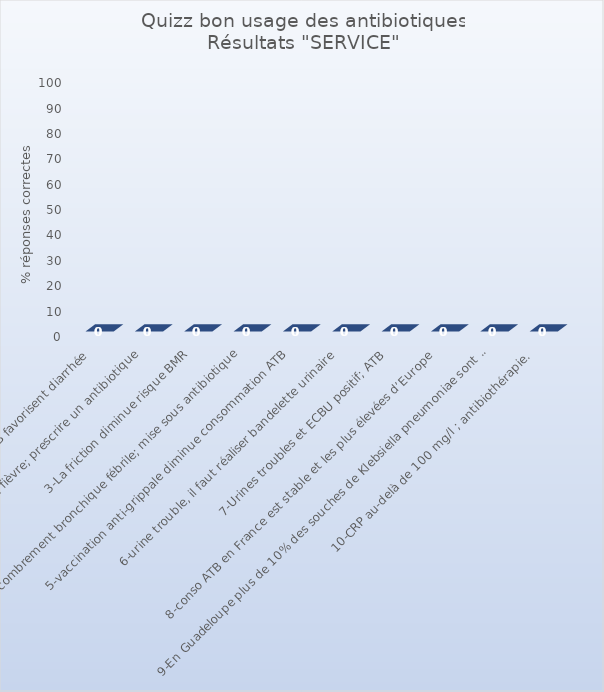
| Category | Series 0 |
|---|---|
| 1-ATB favorisent diarrhée | 0 |
| 2-escarre purulent et fièvre; prescrire un antibiotique | 0 |
| 3-La friction diminue risque BMR | 0 |
| 4-encombrement bronchique fébrile; mise sous antibiotique | 0 |
| 5-vaccination anti-grippale diminue consommation ATB | 0 |
| 6-urine trouble, il faut réaliser bandelette urinaire | 0 |
| 7-Urines troubles et ECBU positif; ATB | 0 |
| 8-conso ATB en France est stable et les plus élevées d’Europe | 0 |
| 9-En Guadeloupe plus de 10% des souches de Klebsiella pneumoniae sont multi- résistants (BLSE) | 0 |
| 10-CRP au-delà de 100 mg/l ; antibiothérapie.  | 0 |